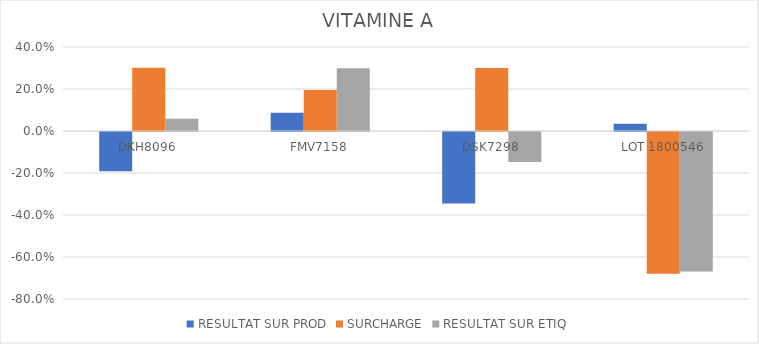
| Category | RESULTAT SUR PROD | SURCHARGE | RESULTAT SUR ETIQ |
|---|---|---|---|
| DKH8096 | -0.186 | 0.301 | 0.058 |
| FMV7158 | 0.087 | 0.195 | 0.299 |
| DSK7298 | -0.34 | 0.3 | -0.142 |
| LOT 1800546 | 0.035 | -0.675 | -0.664 |